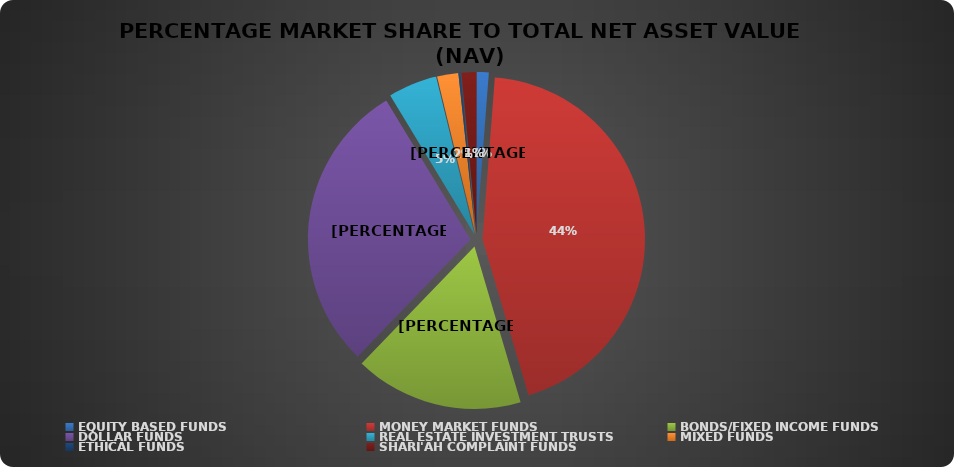
| Category | NET ASSET VALUE |
|---|---|
| EQUITY BASED FUNDS | 23086923138.88 |
| MONEY MARKET FUNDS | 842459027080.454 |
| BONDS/FIXED INCOME FUNDS | 320114444673.33 |
| DOLLAR FUNDS | 554560757841.434 |
| REAL ESTATE INVESTMENT TRUSTS | 92863739575.88 |
| MIXED FUNDS | 40429036765.108 |
| ETHICAL FUNDS | 3988679154.28 |
| SHARI'AH COMPLAINT FUNDS | 28062421939.95 |